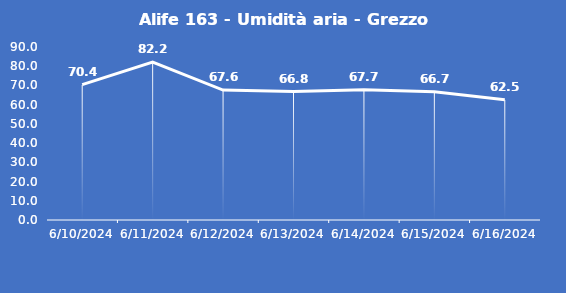
| Category | Alife 163 - Umidità aria - Grezzo (%) |
|---|---|
| 6/10/24 | 70.4 |
| 6/11/24 | 82.2 |
| 6/12/24 | 67.6 |
| 6/13/24 | 66.8 |
| 6/14/24 | 67.7 |
| 6/15/24 | 66.7 |
| 6/16/24 | 62.5 |